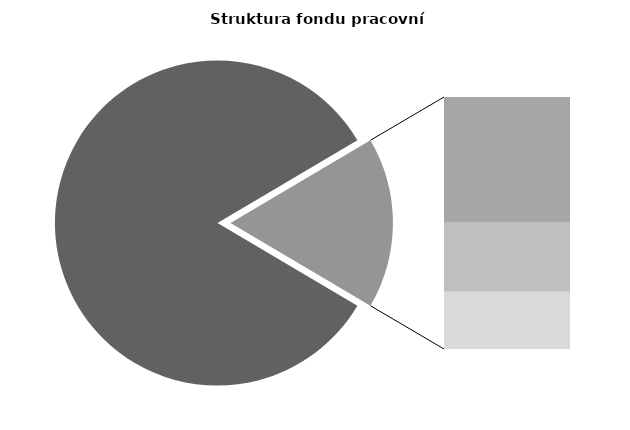
| Category | Series 0 |
|---|---|
| Průměrná měsíční odpracovaná doba bez přesčasu | 140.904 |
| Dovolená | 14.388 |
| Nemoc | 7.908 |
| Jiné | 6.56 |